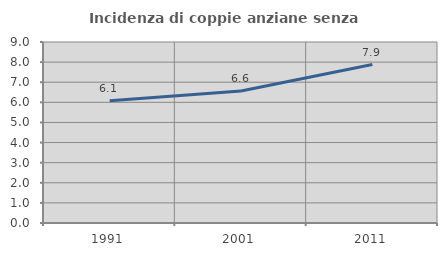
| Category | Incidenza di coppie anziane senza figli  |
|---|---|
| 1991.0 | 6.083 |
| 2001.0 | 6.561 |
| 2011.0 | 7.878 |